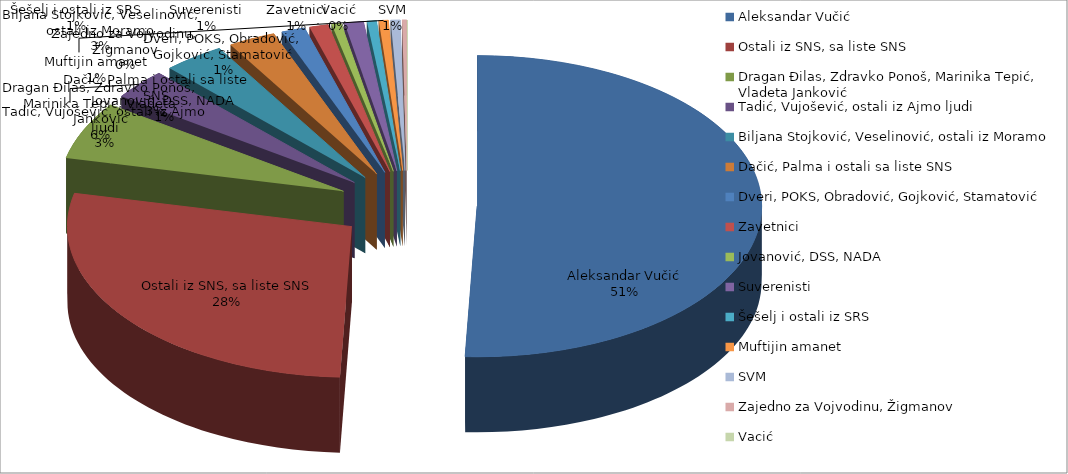
| Category | Series 0 |
|---|---|
| Aleksandar Vučić | 189 |
| Ostali iz SNS, sa liste SNS | 104 |
| Dragan Đilas, Zdravko Ponoš, Marinika Tepić, Vladeta Janković | 23 |
| Tadić, Vujošević, ostali iz Ajmo ljudi | 12 |
| Biljana Stojković, Veselinović, ostali iz Moramo | 13 |
| Dačić, Palma i ostali sa liste SNS | 10 |
| Dveri, POKS, Obradović, Gojković, Stamatović | 5 |
| Zavetnici | 4 |
| Jovanović, DSS, NADA | 2 |
| Suverenisti | 4 |
| Šešelj i ostali iz SRS | 2 |
| Muftijin amanet | 2 |
| SVM | 2 |
| Zajedno za Vojvodinu, Žigmanov | 1 |
| Vacić | 0 |